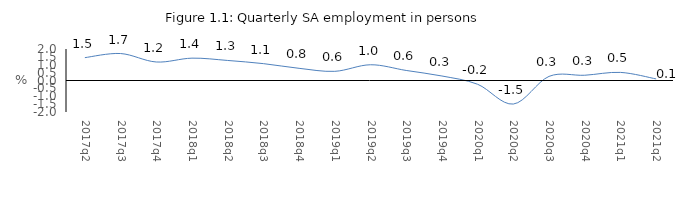
| Category | Series 0 |
|---|---|
| 2017q2 | 1.451 |
| 2017q3 | 1.713 |
| 2017q4 | 1.175 |
| 2018q1 | 1.419 |
| 2018q2 | 1.272 |
| 2018q3 | 1.071 |
| 2018q4 | 0.773 |
| 2019q1 | 0.582 |
| 2019q2 | 0.999 |
| 2019q3 | 0.637 |
| 2019q4 | 0.286 |
| 2020q1 | -0.24 |
| 2020q2 | -1.495 |
| 2020q3 | 0.261 |
| 2020q4 | 0.334 |
| 2021q1 | 0.515 |
| 2021q2 | 0.1 |